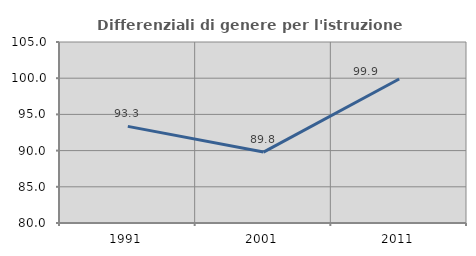
| Category | Differenziali di genere per l'istruzione superiore |
|---|---|
| 1991.0 | 93.348 |
| 2001.0 | 89.795 |
| 2011.0 | 99.894 |